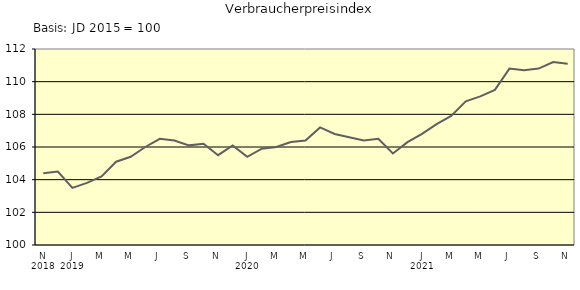
| Category | Series 0 |
|---|---|
| 0 | 104.4 |
| 1 | 104.5 |
| 2 | 103.5 |
| 3 | 103.8 |
| 4 | 104.2 |
| 5 | 105.1 |
| 6 | 105.4 |
| 7 | 106 |
| 8 | 106.5 |
| 9 | 106.4 |
| 10 | 106.1 |
| 11 | 106.2 |
| 12 | 105.5 |
| 13 | 106.1 |
| 14 | 105.4 |
| 15 | 105.9 |
| 16 | 106 |
| 17 | 106.3 |
| 18 | 106.4 |
| 19 | 107.2 |
| 20 | 106.8 |
| 21 | 106.6 |
| 22 | 106.4 |
| 23 | 106.5 |
| 24 | 105.6 |
| 25 | 106.3 |
| 26 | 106.8 |
| 27 | 107.4 |
| 28 | 107.9 |
| 29 | 108.8 |
| 30 | 109.1 |
| 31 | 109.5 |
| 32 | 110.8 |
| 33 | 110.7 |
| 34 | 110.8 |
| 35 | 111.2 |
| 36 | 111.1 |